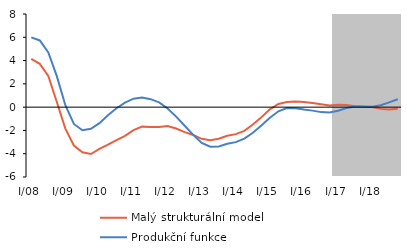
| Category | Malý strukturální model | Produkční funkce |
|---|---|---|
| I/08 | 4.154 | 5.995 |
| II | 3.719 | 5.729 |
| III | 2.674 | 4.699 |
| IV | 0.442 | 2.662 |
| I/09 | -1.843 | 0.168 |
| II | -3.301 | -1.445 |
| III | -3.88 | -1.98 |
| IV | -4.024 | -1.864 |
| I/10 | -3.581 | -1.376 |
| II | -3.219 | -0.702 |
| III | -2.832 | -0.092 |
| IV | -2.459 | 0.393 |
| I/11 | -1.975 | 0.73 |
| II | -1.674 | 0.817 |
| III | -1.704 | 0.685 |
| IV | -1.7 | 0.408 |
| I/12 | -1.617 | -0.112 |
| II | -1.84 | -0.811 |
| III | -2.142 | -1.6 |
| IV | -2.388 | -2.377 |
| I/13 | -2.72 | -3.071 |
| II | -2.845 | -3.397 |
| III | -2.715 | -3.383 |
| IV | -2.452 | -3.147 |
| I/14 | -2.318 | -3.005 |
| II | -2.038 | -2.699 |
| III | -1.493 | -2.201 |
| IV | -0.874 | -1.584 |
| I/15 | -0.189 | -0.913 |
| II | 0.275 | -0.356 |
| III | 0.45 | -0.08 |
| IV | 0.475 | -0.1 |
| I/16 | 0.45 | -0.212 |
| II | 0.35 | -0.299 |
| III | 0.25 | -0.427 |
| IV | 0.133 | -0.463 |
| I/17 | 0.2 | -0.311 |
| II | 0.192 | -0.074 |
| III | 0.07 | 0.064 |
| IV | 0.026 | 0.06 |
| I/18 | 0.02 | 0.038 |
| II | -0.149 | 0.157 |
| III | -0.202 | 0.412 |
| IV | -0.14 | 0.679 |